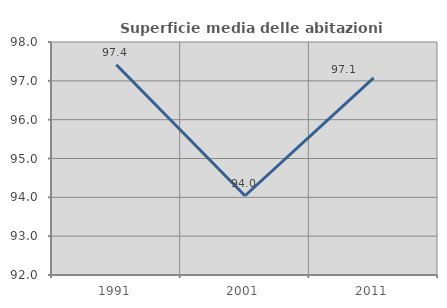
| Category | Superficie media delle abitazioni occupate |
|---|---|
| 1991.0 | 97.415 |
| 2001.0 | 94.041 |
| 2011.0 | 97.077 |